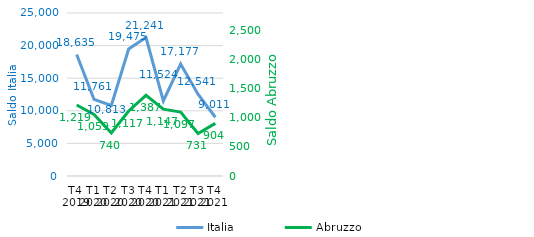
| Category | Italia |
|---|---|
| T4 
2019 | 18634.641 |
| T1
2020 | 11761.027 |
| T2
2020 | 10813.013 |
| T3
2020 | 19474.84 |
| T4
2020 | 21240.608 |
| T1
2021 | 11523.933 |
| T2
2021 | 17177.126 |
| T3
2021 | 12541.258 |
| T4
2021 | 9010.961 |